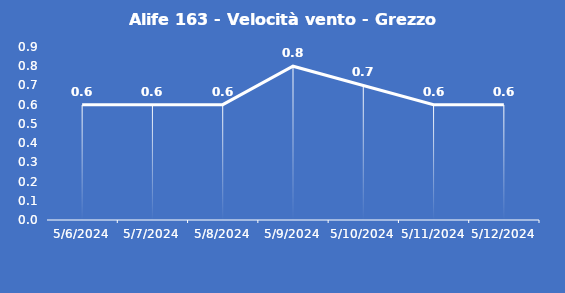
| Category | Alife 163 - Velocità vento - Grezzo (m/s) |
|---|---|
| 5/6/24 | 0.6 |
| 5/7/24 | 0.6 |
| 5/8/24 | 0.6 |
| 5/9/24 | 0.8 |
| 5/10/24 | 0.7 |
| 5/11/24 | 0.6 |
| 5/12/24 | 0.6 |